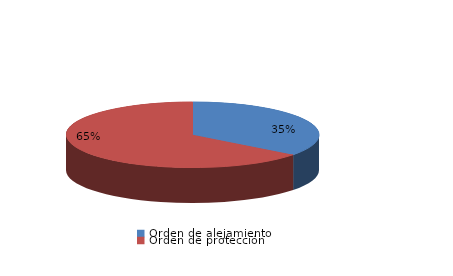
| Category | Series 0 |
|---|---|
| Orden de alejamiento | 58 |
| Orden de protección | 106 |